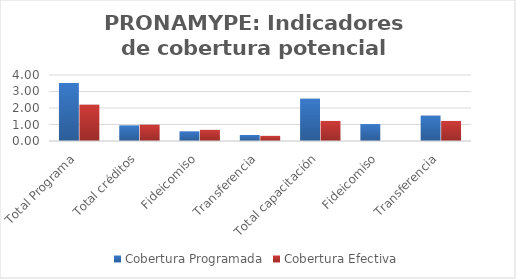
| Category | Cobertura Programada | Cobertura Efectiva |
|---|---|---|
| Total Programa | 3.516 | 2.202 |
| Total créditos | 0.95 | 0.986 |
| Fideicomiso | 0.587 | 0.675 |
| Transferencia | 0.363 | 0.312 |
| Total capacitación | 2.566 | 1.215 |
| Fideicomiso | 1.026 | 0 |
| Transferencia | 1.54 | 1.215 |